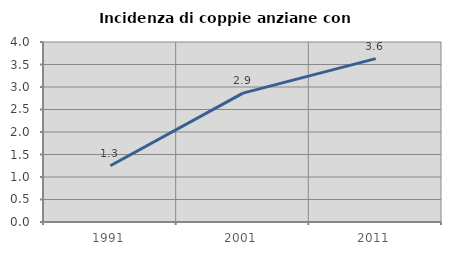
| Category | Incidenza di coppie anziane con figli |
|---|---|
| 1991.0 | 1.25 |
| 2001.0 | 2.865 |
| 2011.0 | 3.631 |